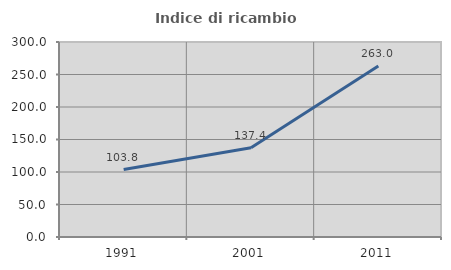
| Category | Indice di ricambio occupazionale  |
|---|---|
| 1991.0 | 103.795 |
| 2001.0 | 137.44 |
| 2011.0 | 262.963 |